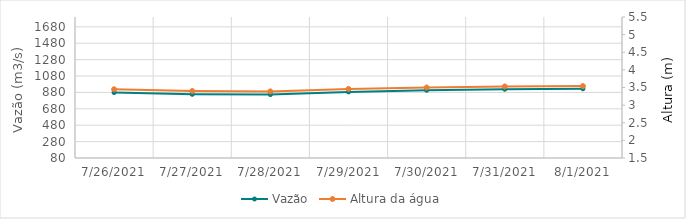
| Category | Vazão |
|---|---|
| 6/6/21 | 1674.93 |
| 6/5/21 | 1687.97 |
| 6/4/21 | 1713.04 |
| 6/3/21 | 1706.09 |
| 6/2/21 | 1680.92 |
| 6/1/21 | 1617.33 |
| 5/31/21 | 1491.54 |